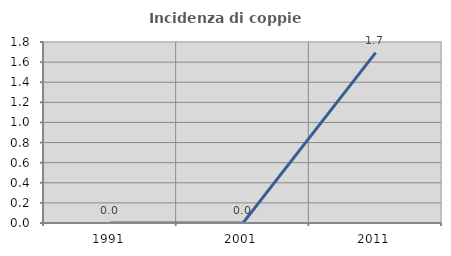
| Category | Incidenza di coppie miste |
|---|---|
| 1991.0 | 0 |
| 2001.0 | 0 |
| 2011.0 | 1.695 |